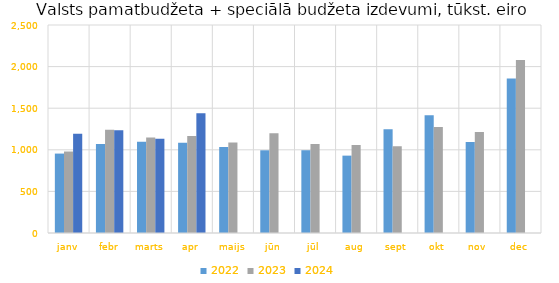
| Category | 2022 | 2023 | 2024 |
|---|---|---|---|
| janv | 954604.585 | 979490.845 | 1193977.049 |
| febr | 1070533.109 | 1241845.152 | 1234636.197 |
| marts | 1096177.665 | 1147758.348 | 1132798.622 |
| apr | 1085060.388 | 1165647.249 | 1438314.584 |
| maijs | 1032376.247 | 1086477.037 | 0 |
| jūn | 994027.105 | 1200332.508 | 0 |
| jūl | 994781.699 | 1069038.771 | 0 |
| aug | 929865.805 | 1059055.24 | 0 |
| sept | 1247630.19 | 1042251.968 | 0 |
| okt | 1415572.01 | 1274735.47 | 0 |
| nov | 1092974.61 | 1214492.205 | 0 |
| dec | 1857192.044 | 2078569.315 | 0 |